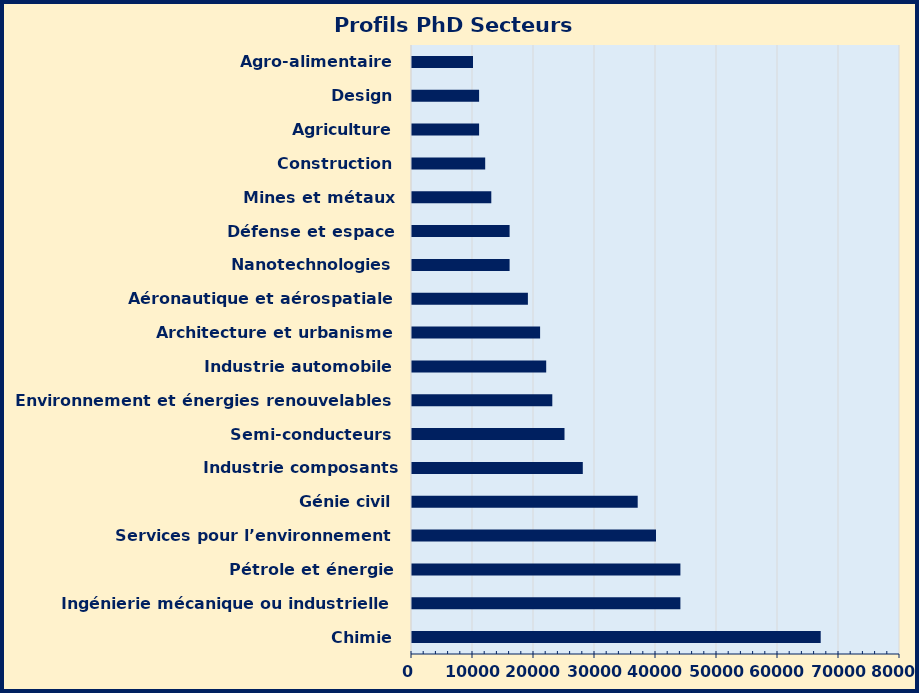
| Category | Series 0 |
|---|---|
| Chimie | 67000 |
| Ingénierie mécanique ou industrielle | 44000 |
| Pétrole et énergie | 44000 |
| Services pour l’environnement | 40000 |
| Génie civil | 37000 |
| Industrie composants électriques/électroniques | 28000 |
| Semi-conducteurs | 25000 |
| Environnement et énergies renouvelables | 23000 |
| Industrie automobile | 22000 |
| Architecture et urbanisme | 21000 |
| Aéronautique et aérospatiale | 19000 |
| Nanotechnologies | 16000 |
| Défense et espace | 16000 |
| Mines et métaux | 13000 |
| Construction | 12000 |
| Agriculture | 11000 |
| Design | 11000 |
| Agro-alimentaire | 10000 |